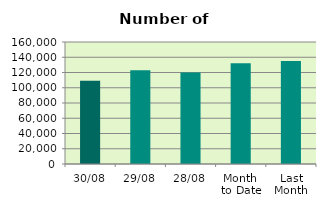
| Category | Series 0 |
|---|---|
| 30/08 | 109142 |
| 29/08 | 123054 |
| 28/08 | 120000 |
| Month 
to Date | 132110.818 |
| Last
Month | 134976 |